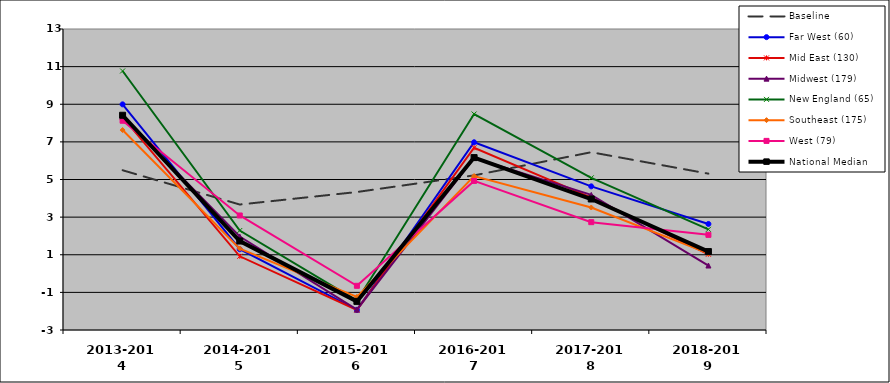
| Category | Baseline | Far West (60) | Mid East (130) | Midwest (179) | New England (65) | Southeast (175) | West (79) | National Median |
|---|---|---|---|---|---|---|---|---|
| 2013-2014 | 5.492 | 8.995 | 8.311 | 8.319 | 10.768 | 7.629 | 8.123 | 8.415 |
| 2014-2015 | 3.67 | 1.293 | 0.918 | 1.97 | 2.288 | 1.327 | 3.088 | 1.73 |
| 2015-2016 | 4.335 | -1.928 | -1.934 | -1.918 | -1.44 | -1.238 | -0.651 | -1.479 |
| 2016-2017 | 5.22 | 6.979 | 6.686 | 6.144 | 8.481 | 5.182 | 4.925 | 6.164 |
| 2017-2018 | 6.45 | 4.636 | 4.041 | 4.183 | 5.088 | 3.511 | 2.732 | 3.963 |
| 2018-2019 | 5.311 | 2.637 | 1.027 | 0.427 | 2.35 | 1.07 | 2.057 | 1.169 |